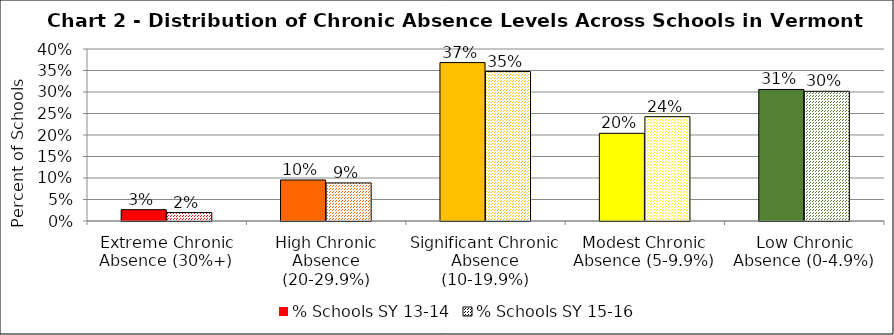
| Category | % Schools SY 13-14 | % Schools SY 15-16 |
|---|---|---|
| Extreme Chronic Absence (30%+) | 0.026 | 0.02 |
| High Chronic Absence (20-29.9%) | 0.095 | 0.089 |
| Significant Chronic Absence (10-19.9%) | 0.368 | 0.348 |
| Modest Chronic Absence (5-9.9%) | 0.204 | 0.243 |
| Low Chronic Absence (0-4.9%) | 0.306 | 0.302 |